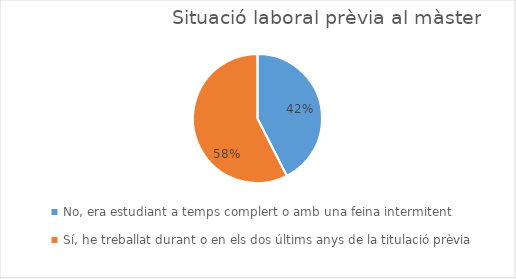
| Category | Series 0 |
|---|---|
| No, era estudiant a temps complert o amb una feina intermitent
 | 48 |
| Sí, he treballat durant o en els dos últims anys de la titulació prèvia | 65 |